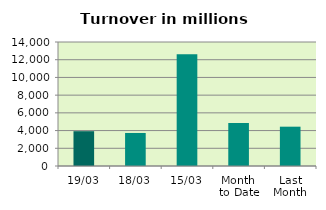
| Category | Series 0 |
|---|---|
| 19/03 | 3928.928 |
| 18/03 | 3729.969 |
| 15/03 | 12623.63 |
| Month 
to Date | 4866.315 |
| Last
Month | 4438.793 |